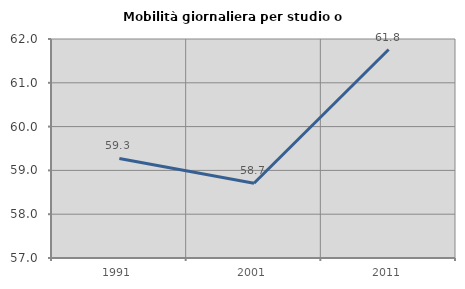
| Category | Mobilità giornaliera per studio o lavoro |
|---|---|
| 1991.0 | 59.272 |
| 2001.0 | 58.705 |
| 2011.0 | 61.759 |